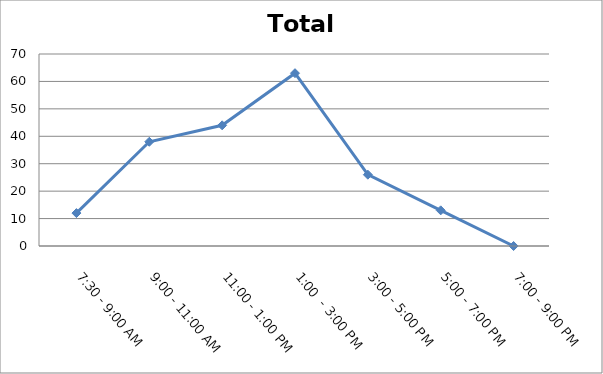
| Category | Total |
|---|---|
| 7:30 - 9:00 AM | 12 |
| 9:00 - 11:00 AM | 38 |
| 11:00 - 1:00 PM | 44 |
| 1:00  - 3:00 PM | 63 |
| 3:00 - 5:00 PM | 26 |
| 5:00 - 7:00 PM | 13 |
| 7:00 - 9:00 PM | 0 |